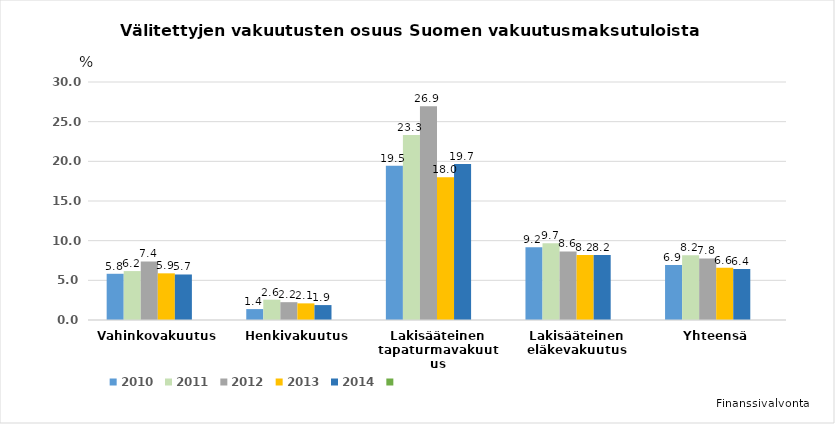
| Category | 2010 | 2011 | 2012 | 2013 | 2014 | Series 5 |
|---|---|---|---|---|---|---|
| Vahinkovakuutus | 5.826 | 6.168 | 7.375 | 5.882 | 5.737 |  |
| Henkivakuutus | 1.376 | 2.56 | 2.246 | 2.097 | 1.88 |  |
| Lakisääteinen tapaturmavakuutus | 19.457 | 23.324 | 26.944 | 17.98 | 19.654 |  |
| Lakisääteinen eläkevakuutus | 9.174 | 9.661 | 8.637 | 8.204 | 8.203 |  |
| Yhteensä | 6.932 | 8.167 | 7.754 | 6.584 | 6.436 |  |